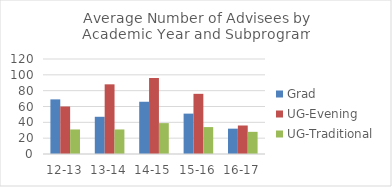
| Category | Grad | UG-Evening | UG-Traditional |
|---|---|---|---|
| 12-13 | 69 | 60 | 31 |
| 13-14 | 47 | 88 | 31 |
| 14-15 | 66 | 96 | 39 |
| 15-16 | 51 | 76 | 34 |
| 16-17 | 32 | 36 | 28 |